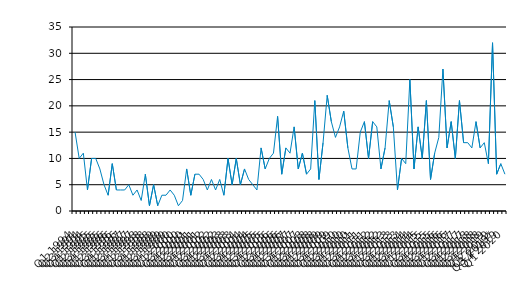
| Category | Series 0 |
|---|---|
| Q1 1994 | 15 |
| Q2 1994 | 10 |
| Q3 1994 | 11 |
| Q4 1994 | 4 |
| Q1 1995 | 10 |
| Q2 1995 | 10 |
| Q3 1995 | 8 |
| Q4 1995 | 5 |
| Q1 1996 | 3 |
| Q2 1996 | 9 |
| Q3 1996 | 4 |
| Q4 1996 | 4 |
| Q1 1997 | 4 |
| Q2 1997 | 5 |
| Q3 1997 | 3 |
| Q4 1997 | 4 |
| Q1 1998 | 2 |
| Q2 1998 | 7 |
| Q3 1998 | 1 |
| Q4 1998 | 5 |
| Q1 1999 | 1 |
| Q2 1999 | 3 |
| Q3 1999 | 3 |
| Q4 1999 | 4 |
| Q1 2000 | 3 |
| Q2 2000 | 1 |
| Q3 2000 | 2 |
| Q4 2000 | 8 |
| Q1 2001 | 3 |
| Q2 2001 | 7 |
| Q3 2001 | 7 |
| Q4 2001 | 6 |
| Q1 2002 | 4 |
| Q2 2002 | 6 |
| Q3 2002 | 4 |
| Q4 2002 | 6 |
| Q1 2003 | 3 |
| Q2 2003 | 10 |
| Q3 2003 | 5 |
| Q4 2003 | 10 |
| Q1 2004 | 5 |
| Q2 2004 | 8 |
| Q3 2004 | 6 |
| Q4 2004 | 5 |
| Q1 2005 | 4 |
| Q2 2005 | 12 |
| Q3 2005 | 8 |
| Q4 2005 | 10 |
| Q1 2006 | 11 |
| Q2 2006 | 18 |
| Q3 2006 | 7 |
| Q4 2006 | 12 |
| Q1 2007 | 11 |
| Q2 2007 | 16 |
| Q3 2007 | 8 |
| Q4 2007 | 11 |
| Q1 2008 | 7 |
| Q2 2008 | 8 |
| Q3 2008 | 21 |
| Q4 2008 | 6 |
| Q1 2009 | 13 |
| Q2 2009 | 22 |
| Q3 2009 | 17 |
| Q4 2009 | 14 |
| Q1 2010 | 16 |
| Q2 2010 | 19 |
| Q3 2010 | 12 |
| Q4 2010 | 8 |
| Q1 2011 | 8 |
| Q2 2011 | 15 |
| Q3 2011 | 17 |
| Q4 2011 | 10 |
| Q1 2012 | 17 |
| Q2 2012 | 16 |
| Q3 2012 | 8 |
| Q4 2012 | 12 |
| Q1 2013 | 21 |
| Q2 2013 | 16 |
| Q3 2013 | 4 |
| Q4 2013 | 10 |
| Q1 2014 | 9 |
| Q2 2014 | 25 |
| Q3 2014 | 8 |
| Q4 2014 | 16 |
| Q1 2015 | 10 |
| Q2 2015 | 21 |
| Q3 2015 | 6 |
| Q4 2015 | 11 |
| Q1 2016 | 14 |
| Q2 2016 | 27 |
| Q3 2016 | 12 |
| Q4 2016 | 17 |
| Q1 2017 | 10 |
| Q2 2017 | 21 |
| Q3 2017 | 13 |
| Q4 2017 | 13 |
| Q1 2018 | 12 |
| Q2 2018 | 17 |
| Q3 2018 | 12 |
| Q4 2018 | 13 |
| Q1 2019 | 9 |
| Q2 2019 | 32 |
| Q3 2019* | 7 |
| Q4 2019 | 9 |
| Q1 2020 | 7 |